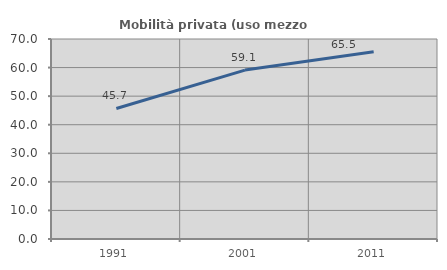
| Category | Mobilità privata (uso mezzo privato) |
|---|---|
| 1991.0 | 45.687 |
| 2001.0 | 59.124 |
| 2011.0 | 65.509 |